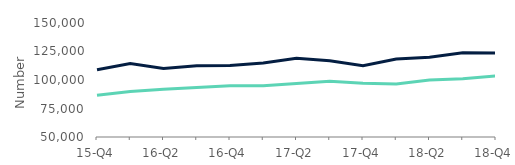
| Category | First-time
buyers | Homemovers |
|---|---|---|
| 15-Q4 | 86652 | 109002 |
| 16-Q1 | 90000 | 114500 |
| 16-Q2 | 91800 | 110047.5 |
| 16-Q3 | 93450 | 112500 |
| 16-Q4 | 95000 | 112755 |
| 17-Q1 | 95000 | 115000 |
| 17-Q2 | 96825 | 119000 |
| 17-Q3 | 99000 | 116875 |
| 17-Q4 | 97200 | 112450 |
| 18-Q1 | 96425 | 118325 |
| 18-Q2 | 100000 | 120000 |
| 18-Q3 | 101000 | 123825 |
| 18-Q4 | 103500 | 123750 |